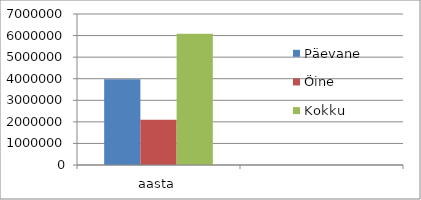
| Category | Päevane | Öine | Kokku |
|---|---|---|---|
| aasta | 3980117.8 | 2099134.3 | 6079252.1 |